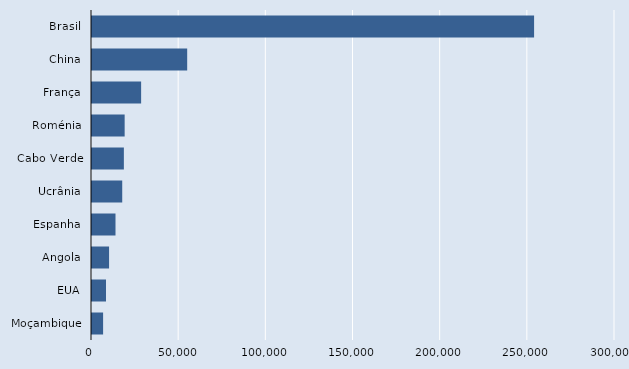
| Category | Series 0 |
|---|---|
| Brasil | 253590 |
| China | 54600 |
| França | 28180 |
| Roménia | 18730 |
| Cabo Verde | 18280 |
| Ucrânia | 17340 |
| Espanha | 13480 |
| Angola | 9790 |
| EUA | 8040 |
| Moçambique | 6370 |